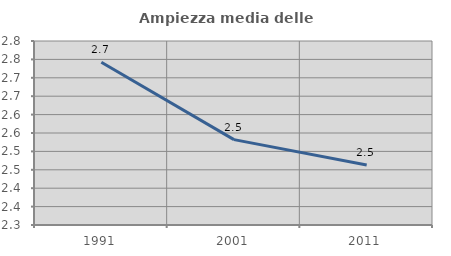
| Category | Ampiezza media delle famiglie |
|---|---|
| 1991.0 | 2.742 |
| 2001.0 | 2.532 |
| 2011.0 | 2.463 |